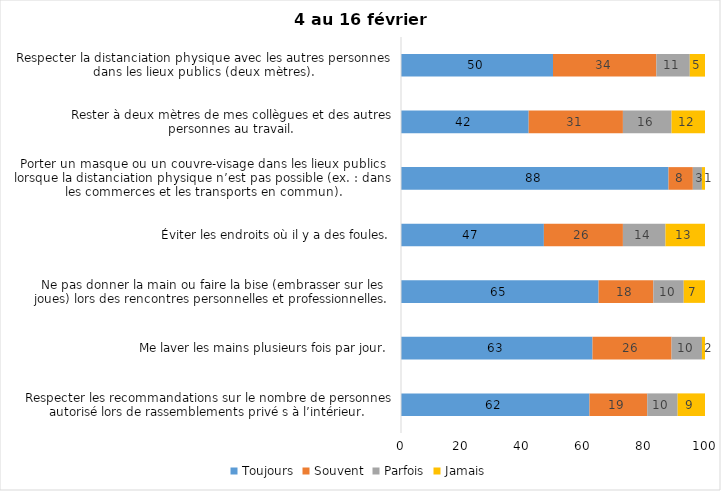
| Category | Toujours | Souvent | Parfois | Jamais |
|---|---|---|---|---|
| Respecter les recommandations sur le nombre de personnes autorisé lors de rassemblements privé s à l’intérieur. | 62 | 19 | 10 | 9 |
| Me laver les mains plusieurs fois par jour. | 63 | 26 | 10 | 2 |
| Ne pas donner la main ou faire la bise (embrasser sur les joues) lors des rencontres personnelles et professionnelles. | 65 | 18 | 10 | 7 |
| Éviter les endroits où il y a des foules. | 47 | 26 | 14 | 13 |
| Porter un masque ou un couvre-visage dans les lieux publics lorsque la distanciation physique n’est pas possible (ex. : dans les commerces et les transports en commun). | 88 | 8 | 3 | 1 |
| Rester à deux mètres de mes collègues et des autres personnes au travail. | 42 | 31 | 16 | 12 |
| Respecter la distanciation physique avec les autres personnes dans les lieux publics (deux mètres). | 50 | 34 | 11 | 5 |